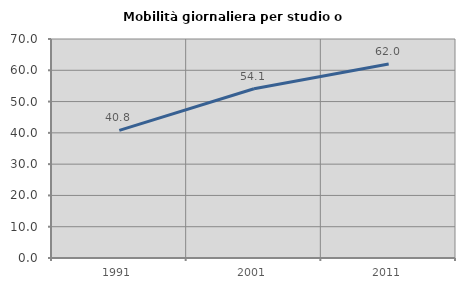
| Category | Mobilità giornaliera per studio o lavoro |
|---|---|
| 1991.0 | 40.772 |
| 2001.0 | 54.089 |
| 2011.0 | 62.022 |